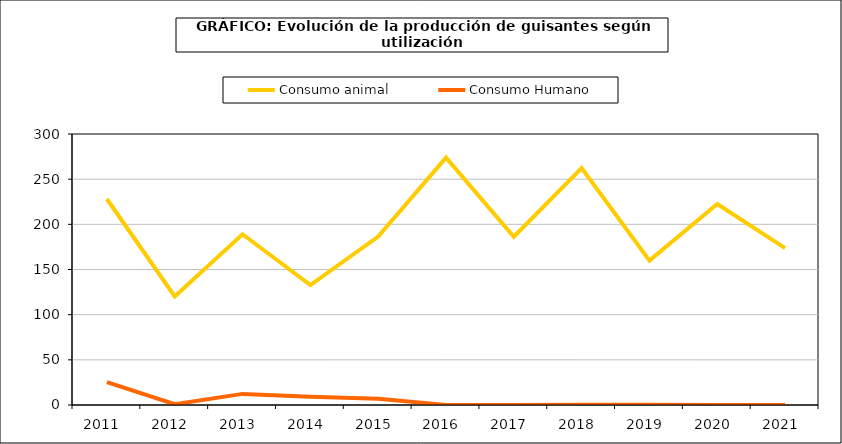
| Category | Consumo animal | Consumo Humano |
|---|---|---|
| 2011.0 | 228.032 | 25.395 |
| 2012.0 | 120.217 | 0.857 |
| 2013.0 | 189.031 | 12.295 |
| 2014.0 | 132.687 | 9.168 |
| 2015.0 | 186.379 | 7.01 |
| 2016.0 | 273.873 | 0.081 |
| 2017.0 | 186.313 | 0.093 |
| 2018.0 | 262.231 | 0.336 |
| 2019.0 | 159.821 | 0.294 |
| 2020.0 | 222.415 | 0.044 |
| 2021.0 | 173.71 | 0.041 |